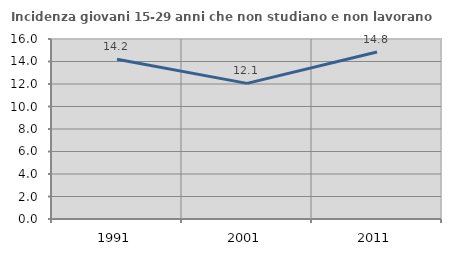
| Category | Incidenza giovani 15-29 anni che non studiano e non lavorano  |
|---|---|
| 1991.0 | 14.194 |
| 2001.0 | 12.055 |
| 2011.0 | 14.847 |